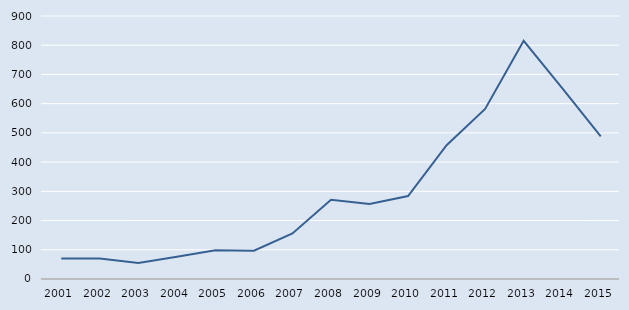
| Category | Series 0 |
|---|---|
| 2001.0 | 70 |
| 2002.0 | 70 |
| 2003.0 | 55 |
| 2004.0 | 76 |
| 2005.0 | 98 |
| 2006.0 | 97 |
| 2007.0 | 156 |
| 2008.0 | 271 |
| 2009.0 | 257 |
| 2010.0 | 284 |
| 2011.0 | 458 |
| 2012.0 | 582 |
| 2013.0 | 815 |
| 2014.0 | 653 |
| 2015.0 | 488 |